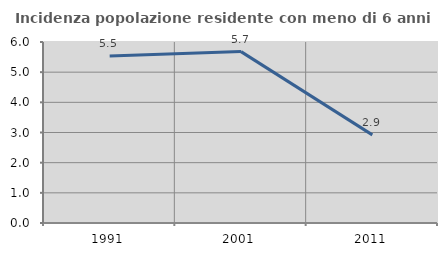
| Category | Incidenza popolazione residente con meno di 6 anni |
|---|---|
| 1991.0 | 5.533 |
| 2001.0 | 5.681 |
| 2011.0 | 2.921 |